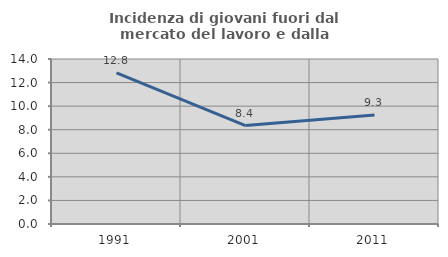
| Category | Incidenza di giovani fuori dal mercato del lavoro e dalla formazione  |
|---|---|
| 1991.0 | 12.821 |
| 2001.0 | 8.355 |
| 2011.0 | 9.254 |